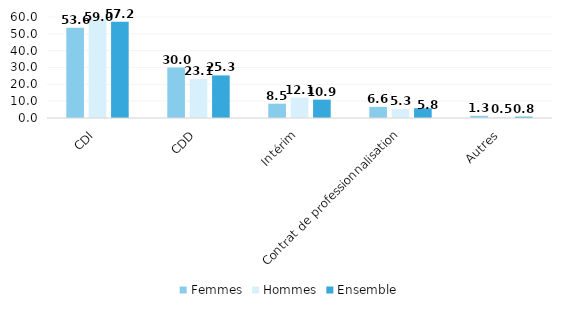
| Category | Femmes | Hommes | Ensemble |
|---|---|---|---|
| CDI | 53.6 | 59 | 57.2 |
| CDD | 30 | 23.1 | 25.3 |
| Intérim | 8.5 | 12.1 | 10.9 |
| Contrat de professionnalisation | 6.6 | 5.3 | 5.8 |
| Autres | 1.3 | 0.5 | 0.8 |